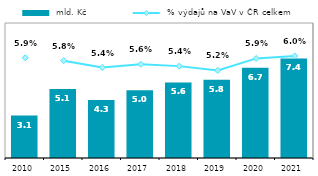
| Category |  mld. Kč |
|---|---|
| 2010.0 | 3.147 |
| 2015.0 | 5.112 |
| 2016.0 | 4.295 |
| 2017.0 | 5.024 |
| 2018.0 | 5.594 |
| 2019.0 | 5.791 |
| 2020.0 | 6.691 |
| 2021.0 | 7.372 |